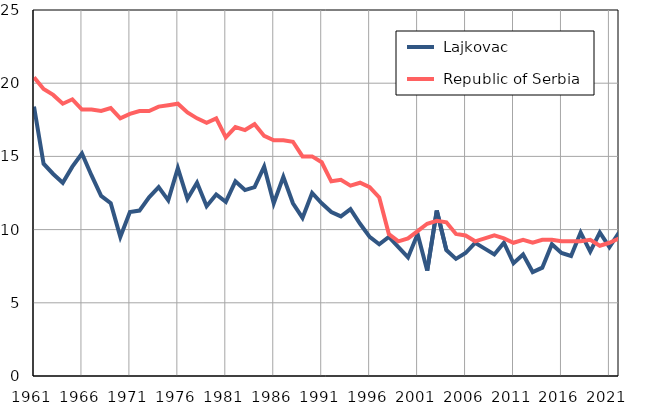
| Category |  Lajkovac |  Republic of Serbia |
|---|---|---|
| 1961.0 | 18.4 | 20.4 |
| 1962.0 | 14.5 | 19.6 |
| 1963.0 | 13.8 | 19.2 |
| 1964.0 | 13.2 | 18.6 |
| 1965.0 | 14.3 | 18.9 |
| 1966.0 | 15.2 | 18.2 |
| 1967.0 | 13.7 | 18.2 |
| 1968.0 | 12.3 | 18.1 |
| 1969.0 | 11.8 | 18.3 |
| 1970.0 | 9.5 | 17.6 |
| 1971.0 | 11.2 | 17.9 |
| 1972.0 | 11.3 | 18.1 |
| 1973.0 | 12.2 | 18.1 |
| 1974.0 | 12.9 | 18.4 |
| 1975.0 | 12 | 18.5 |
| 1976.0 | 14.2 | 18.6 |
| 1977.0 | 12.1 | 18 |
| 1978.0 | 13.2 | 17.6 |
| 1979.0 | 11.6 | 17.3 |
| 1980.0 | 12.4 | 17.6 |
| 1981.0 | 11.9 | 16.3 |
| 1982.0 | 13.3 | 17 |
| 1983.0 | 12.7 | 16.8 |
| 1984.0 | 12.9 | 17.2 |
| 1985.0 | 14.3 | 16.4 |
| 1986.0 | 11.8 | 16.1 |
| 1987.0 | 13.6 | 16.1 |
| 1988.0 | 11.8 | 16 |
| 1989.0 | 10.8 | 15 |
| 1990.0 | 12.5 | 15 |
| 1991.0 | 11.8 | 14.6 |
| 1992.0 | 11.2 | 13.3 |
| 1993.0 | 10.9 | 13.4 |
| 1994.0 | 11.4 | 13 |
| 1995.0 | 10.4 | 13.2 |
| 1996.0 | 9.5 | 12.9 |
| 1997.0 | 9 | 12.2 |
| 1998.0 | 9.5 | 9.7 |
| 1999.0 | 8.8 | 9.2 |
| 2000.0 | 8.1 | 9.4 |
| 2001.0 | 9.7 | 9.9 |
| 2002.0 | 7.2 | 10.4 |
| 2003.0 | 11.3 | 10.6 |
| 2004.0 | 8.6 | 10.5 |
| 2005.0 | 8 | 9.7 |
| 2006.0 | 8.4 | 9.6 |
| 2007.0 | 9.1 | 9.2 |
| 2008.0 | 8.7 | 9.4 |
| 2009.0 | 8.3 | 9.6 |
| 2010.0 | 9.1 | 9.4 |
| 2011.0 | 7.7 | 9.1 |
| 2012.0 | 8.3 | 9.3 |
| 2013.0 | 7.1 | 9.1 |
| 2014.0 | 7.4 | 9.3 |
| 2015.0 | 9 | 9.3 |
| 2016.0 | 8.4 | 9.2 |
| 2017.0 | 8.2 | 9.2 |
| 2018.0 | 9.8 | 9.2 |
| 2019.0 | 8.5 | 9.3 |
| 2020.0 | 9.8 | 8.9 |
| 2021.0 | 8.8 | 9.1 |
| 2022.0 | 9.8 | 9.4 |